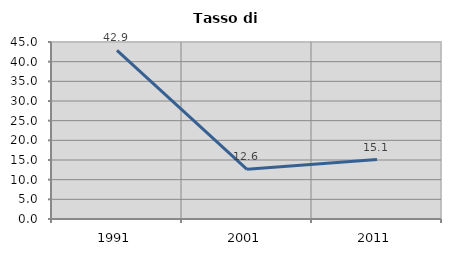
| Category | Tasso di disoccupazione   |
|---|---|
| 1991.0 | 42.857 |
| 2001.0 | 12.632 |
| 2011.0 | 15.116 |